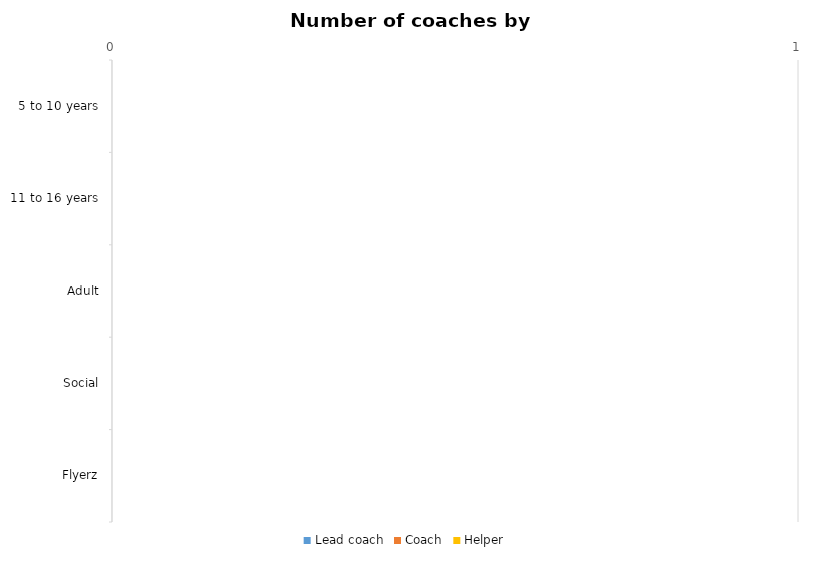
| Category | Lead coach | Coach | Helper |
|---|---|---|---|
| 5 to 10 years | 0 | 0 | 0 |
| 11 to 16 years | 0 | 0 | 0 |
| Adult | 0 | 0 | 0 |
| Social | 0 | 0 | 0 |
| Flyerz | 0 | 0 | 0 |